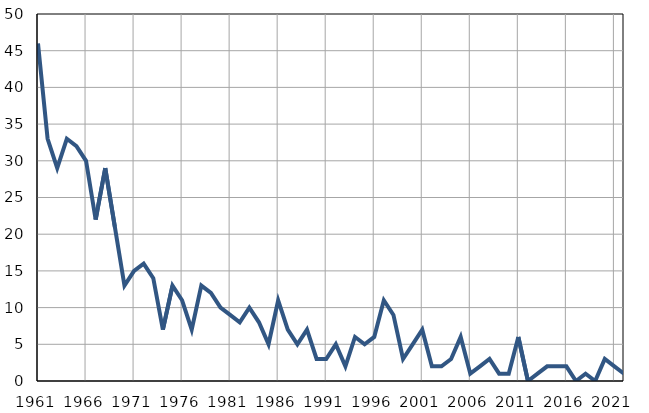
| Category | Infants
deaths |
|---|---|
| 1961.0 | 46 |
| 1962.0 | 33 |
| 1963.0 | 29 |
| 1964.0 | 33 |
| 1965.0 | 32 |
| 1966.0 | 30 |
| 1967.0 | 22 |
| 1968.0 | 29 |
| 1969.0 | 21 |
| 1970.0 | 13 |
| 1971.0 | 15 |
| 1972.0 | 16 |
| 1973.0 | 14 |
| 1974.0 | 7 |
| 1975.0 | 13 |
| 1976.0 | 11 |
| 1977.0 | 7 |
| 1978.0 | 13 |
| 1979.0 | 12 |
| 1980.0 | 10 |
| 1981.0 | 9 |
| 1982.0 | 8 |
| 1983.0 | 10 |
| 1984.0 | 8 |
| 1985.0 | 5 |
| 1986.0 | 11 |
| 1987.0 | 7 |
| 1988.0 | 5 |
| 1989.0 | 7 |
| 1990.0 | 3 |
| 1991.0 | 3 |
| 1992.0 | 5 |
| 1993.0 | 2 |
| 1994.0 | 6 |
| 1995.0 | 5 |
| 1996.0 | 6 |
| 1997.0 | 11 |
| 1998.0 | 9 |
| 1999.0 | 3 |
| 2000.0 | 5 |
| 2001.0 | 7 |
| 2002.0 | 2 |
| 2003.0 | 2 |
| 2004.0 | 3 |
| 2005.0 | 6 |
| 2006.0 | 1 |
| 2007.0 | 2 |
| 2008.0 | 3 |
| 2009.0 | 1 |
| 2010.0 | 1 |
| 2011.0 | 6 |
| 2012.0 | 0 |
| 2013.0 | 1 |
| 2014.0 | 2 |
| 2015.0 | 2 |
| 2016.0 | 2 |
| 2017.0 | 0 |
| 2018.0 | 1 |
| 2019.0 | 0 |
| 2020.0 | 3 |
| 2021.0 | 2 |
| 2022.0 | 1 |